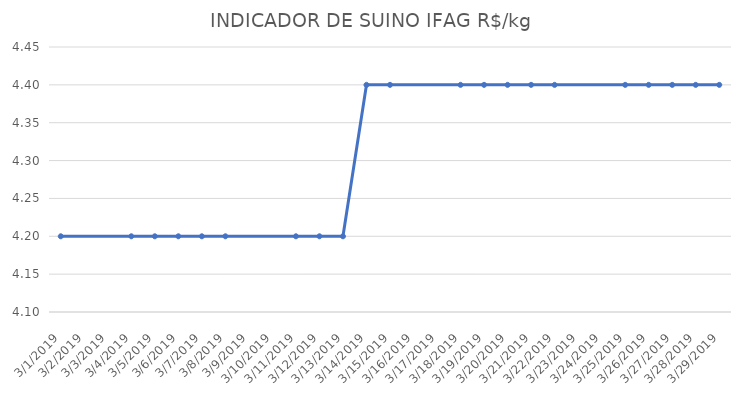
| Category | INDICADOR DE SUINO IFAG |
|---|---|
| 3/1/19 | 4.2 |
| 3/4/19 | 4.2 |
| 3/5/19 | 4.2 |
| 3/6/19 | 4.2 |
| 3/7/19 | 4.2 |
| 3/8/19 | 4.2 |
| 3/11/19 | 4.2 |
| 3/12/19 | 4.2 |
| 3/13/19 | 4.2 |
| 3/14/19 | 4.4 |
| 3/15/19 | 4.4 |
| 3/18/19 | 4.4 |
| 3/19/19 | 4.4 |
| 3/20/19 | 4.4 |
| 3/21/19 | 4.4 |
| 3/22/19 | 4.4 |
| 3/25/19 | 4.4 |
| 3/26/19 | 4.4 |
| 3/27/19 | 4.4 |
| 3/28/19 | 4.4 |
| 3/29/19 | 4.4 |